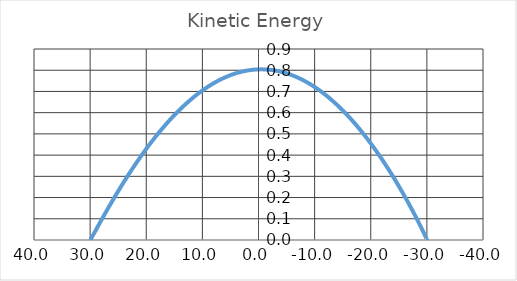
| Category | Series 0 |
|---|---|
| 30.000000000000007 | 0 |
| 29.969251271688933 | 0.001 |
| 29.907782401459603 | 0.003 |
| 29.815650562036044 | 0.007 |
| 29.692941512104007 | 0.013 |
| 29.539769595142385 | 0.02 |
| 29.35627773672376 | 0.029 |
| 29.142637439316722 | 0.039 |
| 28.899048773394565 | 0.051 |
| 28.625740363436094 | 0.064 |
| 28.322969367196393 | 0.078 |
| 27.99102144643041 | 0.094 |
| 27.630210727071546 | 0.111 |
| 27.240879746703506 | 0.129 |
| 26.823399387017524 | 0.148 |
| 26.378168788820858 | 0.169 |
| 25.905615247057472 | 0.19 |
| 25.406194083219766 | 0.212 |
| 24.88038849247254 | 0.235 |
| 24.328709362777982 | 0.259 |
| 23.751695063305238 | 0.283 |
| 23.14991119943004 | 0.308 |
| 22.52395033168065 | 0.334 |
| 21.874431656065944 | 0.359 |
| 21.202000643330283 | 0.385 |
| 20.507328634818098 | 0.411 |
| 19.791112392798354 | 0.437 |
| 19.054073603294707 | 0.463 |
| 18.296958329690703 | 0.488 |
| 17.520536415628868 | 0.513 |
| 16.725600835997156 | 0.538 |
| 15.91296699509357 | 0.562 |
| 15.083471971377783 | 0.586 |
| 14.237973708554568 | 0.609 |
| 13.377350153085015 | 0.631 |
| 12.50249833858459 | 0.652 |
| 11.61433341793859 | 0.672 |
| 10.713787644341881 | 0.69 |
| 9.801809302846978 | 0.708 |
| 8.879361594378679 | 0.724 |
| 7.947421474540327 | 0.739 |
| 7.006978449892392 | 0.753 |
| 6.059033334724281 | 0.765 |
| 5.104596971661064 | 0.776 |
| 4.144688919744449 | 0.785 |
| 3.1803361138980506 | 0.792 |
| 2.2125714999276704 | 0.797 |
| 1.2424326494146973 | 0.801 |
| 0.2709603590324336 | 0.804 |
| -0.7008027610511226 | 0.804 |
| -1.6718137049264628 | 0.803 |
| -2.641030490040946 | 0.8 |
| -3.6074135728199597 | 0.795 |
| -4.569927256018527 | 0.789 |
| -5.527541083082401 | 0.781 |
| -6.479231214909474 | 0.771 |
| -7.423981784553087 | 0.76 |
| -8.360786225596593 | 0.747 |
| -9.288648570151029 | 0.733 |
| -10.206584712682039 | 0.717 |
| -11.113623636155326 | 0.7 |
| -12.008808597298136 | 0.682 |
| -12.891198268104315 | 0.663 |
| -13.759867831057786 | 0.642 |
| -14.61391002591059 | 0.621 |
| -15.452436146222105 | 0.599 |
| -16.27457698424211 | 0.575 |
| -17.07948372309761 | 0.552 |
| -17.86632877561805 | 0.527 |
| -18.634306569501682 | 0.502 |
| -19.382634278884158 | 0.477 |
| -20.110552502715205 | 0.451 |
| -20.81732589067758 | 0.425 |
| -21.502243717691794 | 0.399 |
| -22.164620408337452 | 0.374 |
| -22.80379601278597 | 0.348 |
| -23.419136636077525 | 0.322 |
| -24.01003482278639 | 0.297 |
| -24.575909899302115 | 0.273 |
| -25.116208276108264 | 0.249 |
| -25.630403712565972 | 0.225 |
| -26.117997546805217 | 0.202 |
| -26.578518893393525 | 0.181 |
| -27.011524811489895 | 0.16 |
| -27.41660044620133 | 0.14 |
| -27.793359145842167 | 0.121 |
| -28.141442557752523 | 0.103 |
| -28.460520705263658 | 0.087 |
| -28.750292048305603 | 0.071 |
| -29.010483530037867 | 0.058 |
| -29.240850611748822 | 0.045 |
| -29.44117729811511 | 0.034 |
| -29.611276154740843 | 0.025 |
| -29.750988319709226 | 0.017 |
| -29.86018351067827 | 0.01 |
| -29.938760028839216 | 0.005 |
| -29.9866447608333 | 0.002 |
| -30.003793179490756 | 0 |
| -29.990189344017967 | 0 |